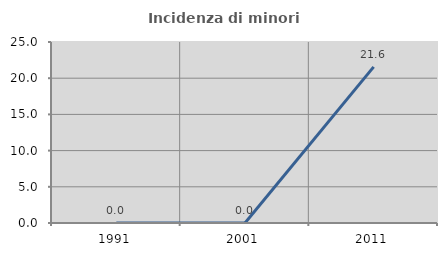
| Category | Incidenza di minori stranieri |
|---|---|
| 1991.0 | 0 |
| 2001.0 | 0 |
| 2011.0 | 21.569 |